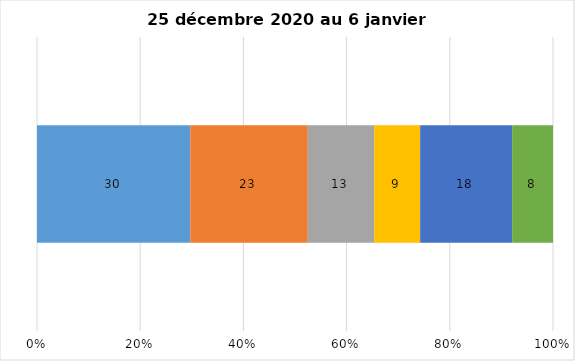
| Category | Plusieurs fois par jour | Une fois par jour | Quelques fois par semaine   | Une fois par semaine ou moins   |  Jamais   |  Je n’utilise pas les médias sociaux |
|---|---|---|---|---|---|---|
| 0 | 30 | 23 | 13 | 9 | 18 | 8 |